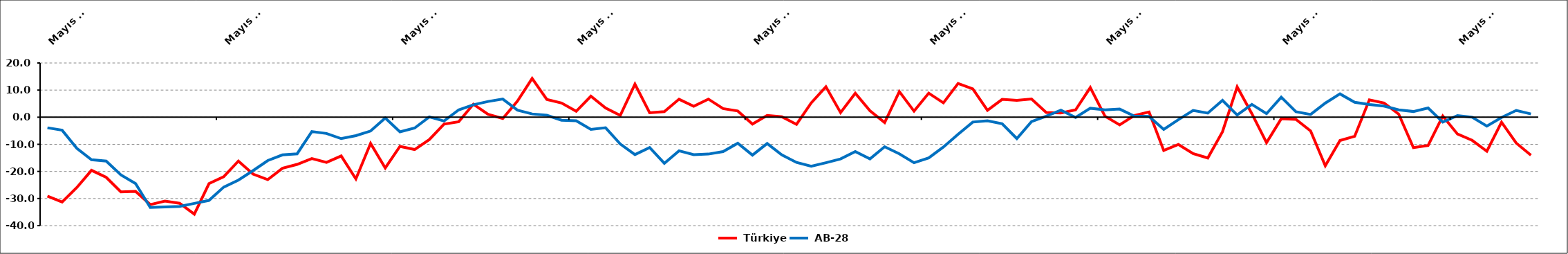
| Category |  Türkiye |  AB-28 |
|---|---|---|
| 2008-05-01 | -29.099 | -3.9 |
| 2008-06-01 | -31.278 | -4.8 |
| 2008-07-01 | -25.941 | -11.5 |
| 2008-08-01 | -19.596 | -15.7 |
| 2008-09-01 | -22.192 | -16.2 |
| 2008-10-01 | -27.524 | -21.3 |
| 2008-11-01 | -27.368 | -24.5 |
| 2008-12-01 | -32.236 | -33.3 |
| 2009-01-01 | -30.952 | -33.1 |
| 2009-02-01 | -31.761 | -32.9 |
| 2009-03-01 | -35.752 | -31.8 |
| 2009-04-01 | -24.499 | -30.7 |
| 2009-05-01 | -21.969 | -25.8 |
| 2009-06-01 | -16.175 | -23.2 |
| 2009-07-01 | -20.979 | -19.7 |
| 2009-08-01 | -23.027 | -16 |
| 2009-09-01 | -18.834 | -13.9 |
| 2009-10-01 | -17.413 | -13.5 |
| 2009-11-01 | -15.279 | -5.3 |
| 2009-12-01 | -16.679 | -6 |
| 2010-01-01 | -14.306 | -7.9 |
| 2010-02-01 | -22.758 | -6.8 |
| 2010-03-01 | -9.682 | -5.1 |
| 2010-04-01 | -18.725 | -0.3 |
| 2010-05-01 | -10.76 | -5.4 |
| 2010-06-01 | -11.927 | -4 |
| 2010-07-01 | -8.24 | 0.1 |
| 2010-08-01 | -2.563 | -1.4 |
| 2010-09-01 | -1.676 | 2.7 |
| 2010-10-01 | 4.786 | 4.6 |
| 2010-11-01 | 1.069 | 5.8 |
| 2010-12-01 | -0.488 | 6.7 |
| 2011-01-01 | 5.946 | 2.6 |
| 2011-02-01 | 14.288 | 1.2 |
| 2011-03-01 | 6.542 | 0.7 |
| 2011-04-01 | 5.248 | -1.1 |
| 2011-05-01 | 2.183 | -1.3 |
| 2011-06-01 | 7.742 | -4.5 |
| 2011-07-01 | 3.39 | -3.9 |
| 2011-08-01 | 0.662 | -9.9 |
| 2011-09-01 | 12.206 | -13.8 |
| 2011-10-01 | 1.637 | -11.2 |
| 2011-11-01 | 2.076 | -17 |
| 2011-12-01 | 6.64 | -12.4 |
| 2012-01-01 | 4.008 | -13.8 |
| 2012-02-01 | 6.679 | -13.6 |
| 2012-03-01 | 3.168 | -12.7 |
| 2012-04-01 | 2.281 | -9.6 |
| 2012-05-01 | -2.533 | -14 |
| 2012-06-01 | 0.662 | -9.7 |
| 2012-07-01 | 0.138 | -13.9 |
| 2012-08-01 | -2.639 | -16.7 |
| 2012-09-01 | 5.273 | -18.1 |
| 2012-10-01 | 11.236 | -16.8 |
| 2012-11-01 | 1.682 | -15.4 |
| 2012-12-01 | 8.819 | -12.7 |
| 2013-01-01 | 2.364 | -15.4 |
| 2013-02-01 | -1.978 | -10.9 |
| 2013-03-01 | 9.425 | -13.5 |
| 2013-04-01 | 2.228 | -16.8 |
| 2013-05-01 | 8.872 | -15 |
| 2013-06-01 | 5.278 | -11 |
| 2013-07-01 | 12.439 | -6.3 |
| 2013-08-01 | 10.461 | -1.8 |
| 2013-09-01 | 2.532 | -1.3 |
| 2013-10-01 | 6.575 | -2.4 |
| 2013-11-01 | 6.199 | -7.9 |
| 2013-12-01 | 6.72 | -1.6 |
| 2014-01-01 | 1.753 | 0.4 |
| 2014-02-01 | 1.55 | 2.6 |
| 2014-03-02 | 2.701 | -0.1 |
| 2014-04-02 | 10.922 | 3.3 |
| 2014-05-02 | 0.361 | 2.7 |
| 2014-06-02 | -2.845 | 3 |
| 2014-07-02 | 0.65 | 0.4 |
| 2014-08-02 | 1.909 | 0.3 |
| 2014-09-02 | -12.288 | -4.5 |
| 2014-10-02 | -10.049 | -0.9 |
| 2014-11-02 | -13.455 | 2.5 |
| 2014-12-02 | -15.047 | 1.5 |
| 2015-01-02 | -5.39 | 6.2 |
| 2015-02-02 | 11.183 | 0.8 |
| 2015-03-02 | 1.311 | 4.7 |
| 2015-04-02 | -9.391 | 1.3 |
| 2015-05-02 | -0.582 | 7.4 |
| 2015-06-02 | -0.803 | 2 |
| 2015-07-02 | -5.064 | 1 |
| 2015-08-02 | -17.908 | 5.2 |
| 2015-09-02 | -8.61 | 8.6 |
| 2015-10-02 | -7.036 | 5.5 |
| 2015-11-02 | 6.373 | 4.7 |
| 2015-12-02 | 5.251 | 4.1 |
| 2016-01-02 | 1.119 | 2.7 |
| 2016-02-02 | -11.222 | 2.1 |
| 2016-03-02 | -10.42 | 3.4 |
| 2016-04-02 | 0.42 | -1.8 |
| 2016-05-02 | -6.221 | 0.6 |
| 2016-06-02 | -8.541 | 0 |
| 2016-07-03 | -12.558 | -3.3 |
| 2016-08-03 | -1.878 | -0.1 |
| 2016-09-03 | -9.541 | 2.5 |
| 2016-10-03 | -14.033 | 1.2 |